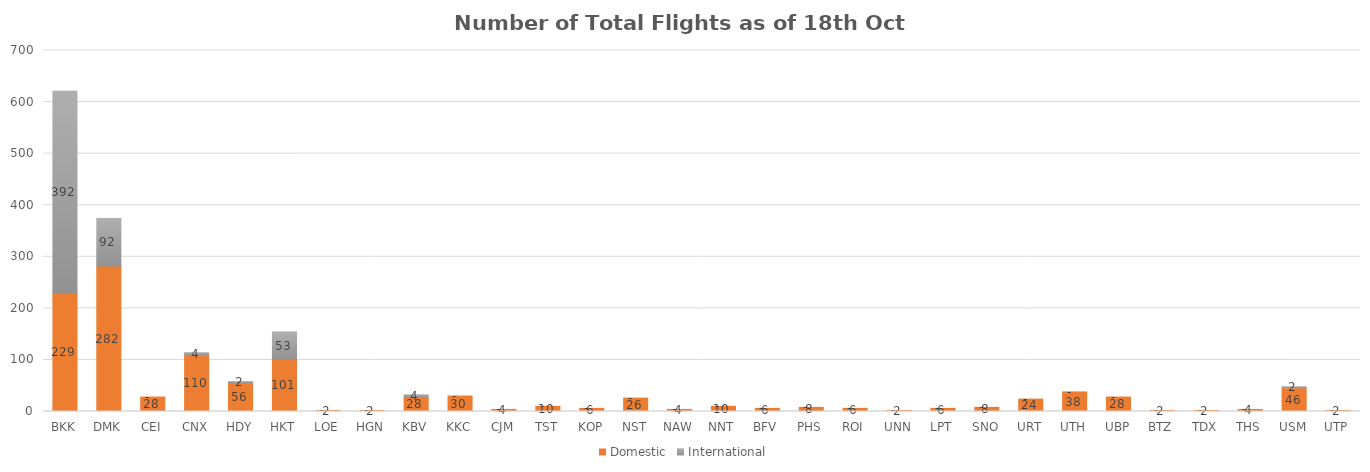
| Category | Domestic | International |
|---|---|---|
| BKK | 229 | 392 |
| DMK | 282 | 92 |
| CEI | 28 | 0 |
| CNX | 110 | 4 |
| HDY | 56 | 2 |
| HKT | 101 | 53 |
| LOE | 2 | 0 |
| HGN | 2 | 0 |
| KBV | 28 | 4 |
| KKC | 30 | 0 |
| CJM | 4 | 0 |
| TST | 10 | 0 |
| KOP | 6 | 0 |
| NST | 26 | 0 |
| NAW | 4 | 0 |
| NNT | 10 | 0 |
| BFV | 6 | 0 |
| PHS | 8 | 0 |
| ROI | 6 | 0 |
| UNN | 2 | 0 |
| LPT | 6 | 0 |
| SNO | 8 | 0 |
| URT | 24 | 0 |
| UTH | 38 | 0 |
| UBP | 28 | 0 |
| BTZ | 2 | 0 |
| TDX | 2 | 0 |
| THS | 4 | 0 |
| USM | 46 | 2 |
| UTP | 2 | 0 |